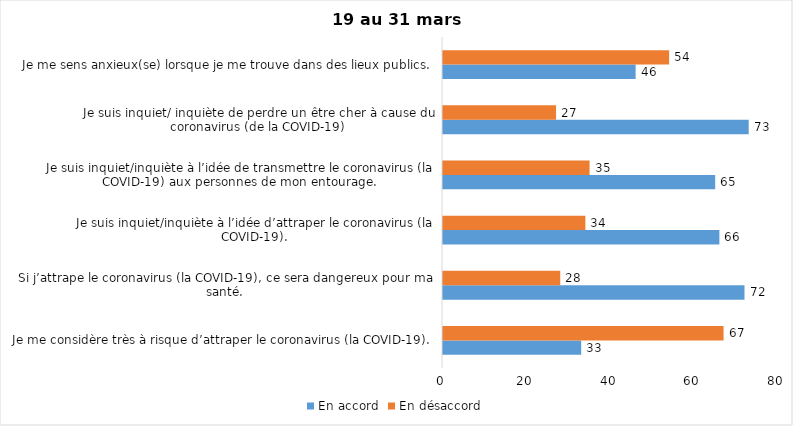
| Category | En accord | En désaccord |
|---|---|---|
| Je me considère très à risque d’attraper le coronavirus (la COVID-19). | 33 | 67 |
| Si j’attrape le coronavirus (la COVID-19), ce sera dangereux pour ma santé. | 72 | 28 |
| Je suis inquiet/inquiète à l’idée d’attraper le coronavirus (la COVID-19). | 66 | 34 |
| Je suis inquiet/inquiète à l’idée de transmettre le coronavirus (la COVID-19) aux personnes de mon entourage. | 65 | 35 |
| Je suis inquiet/ inquiète de perdre un être cher à cause du coronavirus (de la COVID-19) | 73 | 27 |
| Je me sens anxieux(se) lorsque je me trouve dans des lieux publics. | 46 | 54 |